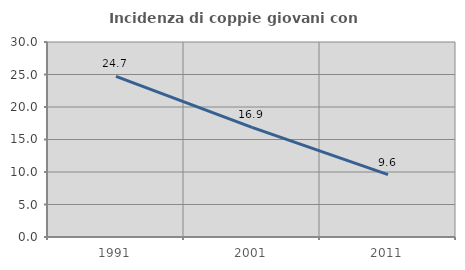
| Category | Incidenza di coppie giovani con figli |
|---|---|
| 1991.0 | 24.721 |
| 2001.0 | 16.863 |
| 2011.0 | 9.595 |